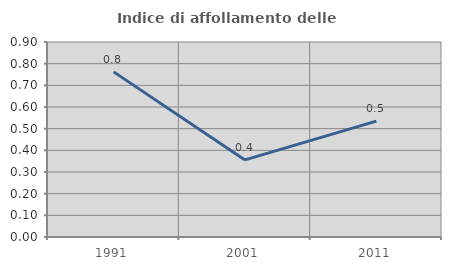
| Category | Indice di affollamento delle abitazioni  |
|---|---|
| 1991.0 | 0.762 |
| 2001.0 | 0.356 |
| 2011.0 | 0.535 |